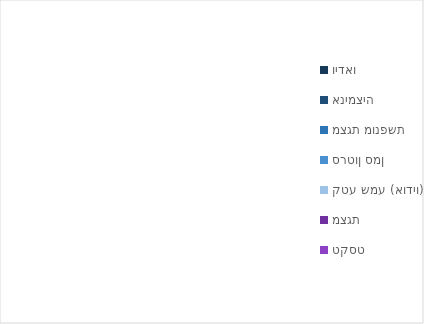
| Category | Series 0 |
|---|---|
| וידאו | 0 |
| אנימציה | 0 |
| מצגת מונפשת | 0 |
| סרטון סמן | 0 |
| קטע שמע (אודיו) | 0 |
| מצגת | 0 |
| טקסט | 0 |